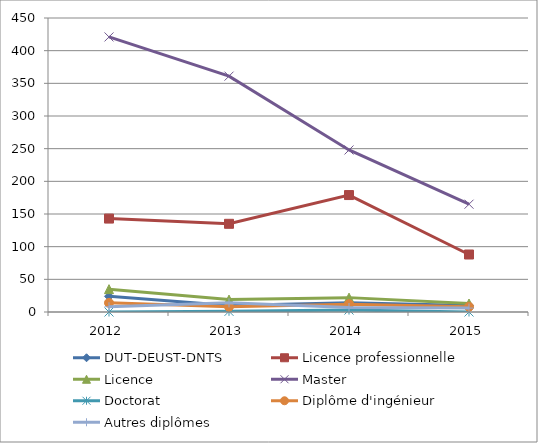
| Category | DUT-DEUST-DNTS | Licence professionnelle | Licence | Master | Doctorat | Diplôme d'ingénieur | Autres diplômes |
|---|---|---|---|---|---|---|---|
| 2012.0 | 24 | 143 | 35 | 421 | 0 | 14 | 8 |
| 2013.0 | 10 | 135 | 19 | 361 | 1 | 8 | 14 |
| 2014.0 | 14 | 179 | 22 | 248 | 3 | 12 | 7 |
| 2015.0 | 10 | 88 | 13 | 165 | 0 | 8 | 6 |